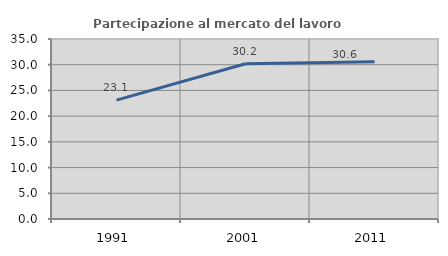
| Category | Partecipazione al mercato del lavoro  femminile |
|---|---|
| 1991.0 | 23.118 |
| 2001.0 | 30.189 |
| 2011.0 | 30.581 |